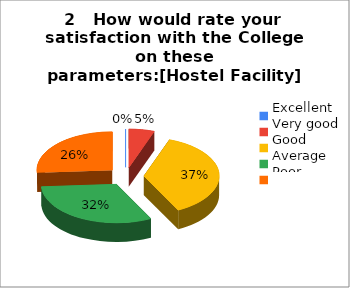
| Category | 2   How would rate your 
satisfaction with the College on these parameters:                             [Hostel Facility] |
|---|---|
| Excellent | 0 |
| Very good | 8 |
| Good | 54 |
| Average | 46 |
| Poor | 38 |